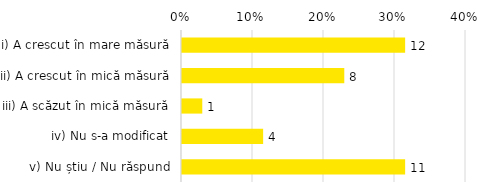
| Category | Total |
|---|---|
| i) A crescut în mare măsură | 0.314 |
| ii) A crescut în mică măsură | 0.229 |
| iii) A scăzut în mică măsură | 0.029 |
| iv) Nu s-a modificat | 0.114 |
| v) Nu știu / Nu răspund | 0.314 |